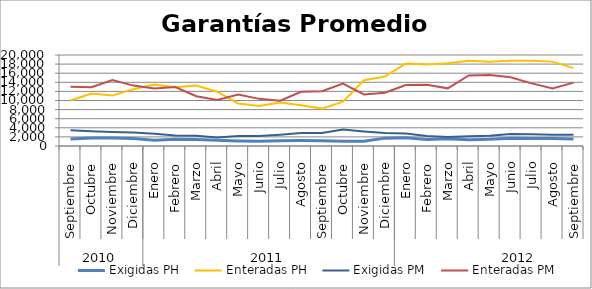
| Category | Exigidas PH | Enteradas PH | Exigidas PM | Enteradas PM |
|---|---|---|---|---|
| 0 | 1528.048 | 9989.528 | 3482.397 | 13040.893 |
| 1 | 1765.671 | 11522.563 | 3249.678 | 12931.878 |
| 2 | 1744.818 | 11123.372 | 3083.204 | 14519.409 |
| 3 | 1659.203 | 12493.623 | 2971.808 | 13273.812 |
| 4 | 1282.931 | 13511.197 | 2715.795 | 12631.271 |
| 5 | 1469.886 | 12912.935 | 2313.398 | 12967.84 |
| 6 | 1451.049 | 13292.147 | 2234.5 | 10944.124 |
| 7 | 1243.266 | 11940.059 | 1876.192 | 10106.188 |
| 8 | 1094.477 | 9346.935 | 2211.516 | 11309.35 |
| 9 | 1038.181 | 8772.488 | 2185.859 | 10360.845 |
| 10 | 1150.33 | 9583.522 | 2484.933 | 9954.534 |
| 11 | 1204.945 | 8947.225 | 2874.347 | 11912.953 |
| 12 | 1181.135 | 8218.837 | 2868.226 | 12046.458 |
| 13 | 1047.181 | 9725.758 | 3619.145 | 13704.352 |
| 14 | 1067.214 | 14456.861 | 3177.175 | 11327.495 |
| 15 | 1729.716 | 15271.717 | 2830.669 | 11719.895 |
| 16 | 1828.564 | 18155.583 | 2744.93 | 13413.991 |
| 17 | 1451.155 | 17917.734 | 2215.902 | 13440.832 |
| 18 | 1587.31 | 18166.129 | 1968.766 | 12673.714 |
| 19 | 1353.003 | 18741.256 | 2118.782 | 15515.723 |
| 20 | 1464.668 | 18540.927 | 2278.002 | 15625.393 |
| 21 | 1719.43 | 18734.539 | 2626.915 | 15127.903 |
| 22 | 1674.023 | 18761.463 | 2556.575 | 13766.49 |
| 23 | 1647.243 | 18544.546 | 2463.76 | 12637.427 |
| 24 | 1556.152 | 17124.972 | 2459.803 | 13929.715 |